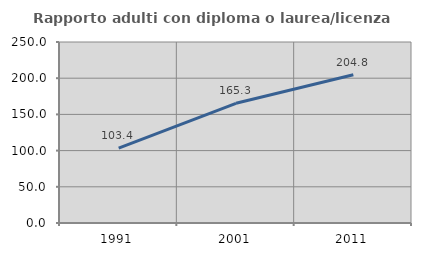
| Category | Rapporto adulti con diploma o laurea/licenza media  |
|---|---|
| 1991.0 | 103.361 |
| 2001.0 | 165.289 |
| 2011.0 | 204.8 |